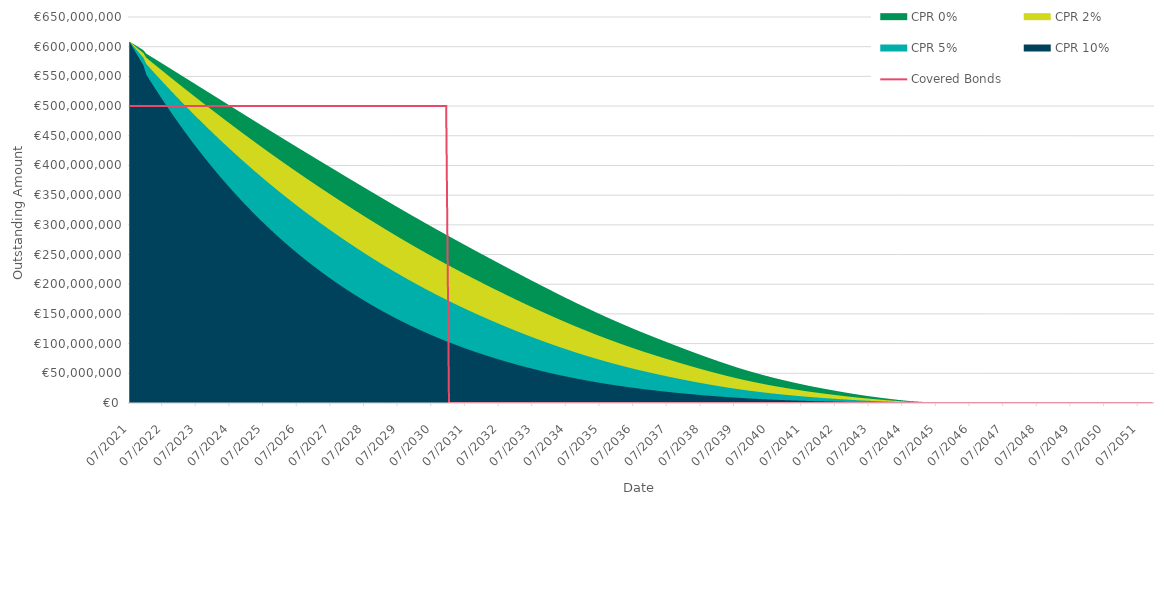
| Category | Covered Bonds |
|---|---|
| 2021-07-31 | 500000000 |
| 2021-08-31 | 500000000 |
| 2021-09-30 | 500000000 |
| 2021-10-31 | 500000000 |
| 2021-11-30 | 500000000 |
| 2021-12-31 | 500000000 |
| 2022-01-31 | 500000000 |
| 2022-02-28 | 500000000 |
| 2022-03-31 | 500000000 |
| 2022-04-30 | 500000000 |
| 2022-05-31 | 500000000 |
| 2022-06-30 | 500000000 |
| 2022-07-31 | 500000000 |
| 2022-08-31 | 500000000 |
| 2022-09-30 | 500000000 |
| 2022-10-31 | 500000000 |
| 2022-11-30 | 500000000 |
| 2022-12-31 | 500000000 |
| 2023-01-31 | 500000000 |
| 2023-02-28 | 500000000 |
| 2023-03-31 | 500000000 |
| 2023-04-30 | 500000000 |
| 2023-05-31 | 500000000 |
| 2023-06-30 | 500000000 |
| 2023-07-31 | 500000000 |
| 2023-08-31 | 500000000 |
| 2023-09-30 | 500000000 |
| 2023-10-31 | 500000000 |
| 2023-11-30 | 500000000 |
| 2023-12-31 | 500000000 |
| 2024-01-31 | 500000000 |
| 2024-02-29 | 500000000 |
| 2024-03-31 | 500000000 |
| 2024-04-30 | 500000000 |
| 2024-05-31 | 500000000 |
| 2024-06-30 | 500000000 |
| 2024-07-31 | 500000000 |
| 2024-08-31 | 500000000 |
| 2024-09-30 | 500000000 |
| 2024-10-31 | 500000000 |
| 2024-11-30 | 500000000 |
| 2024-12-31 | 500000000 |
| 2025-01-31 | 500000000 |
| 2025-02-28 | 500000000 |
| 2025-03-31 | 500000000 |
| 2025-04-30 | 500000000 |
| 2025-05-31 | 500000000 |
| 2025-06-30 | 500000000 |
| 2025-07-31 | 500000000 |
| 2025-08-31 | 500000000 |
| 2025-09-30 | 500000000 |
| 2025-10-31 | 500000000 |
| 2025-11-30 | 500000000 |
| 2025-12-31 | 500000000 |
| 2026-01-31 | 500000000 |
| 2026-02-28 | 500000000 |
| 2026-03-31 | 500000000 |
| 2026-04-30 | 500000000 |
| 2026-05-31 | 500000000 |
| 2026-06-30 | 500000000 |
| 2026-07-31 | 500000000 |
| 2026-08-31 | 500000000 |
| 2026-09-30 | 500000000 |
| 2026-10-31 | 500000000 |
| 2026-11-30 | 500000000 |
| 2026-12-31 | 500000000 |
| 2027-01-31 | 500000000 |
| 2027-02-28 | 500000000 |
| 2027-03-31 | 500000000 |
| 2027-04-30 | 500000000 |
| 2027-05-31 | 500000000 |
| 2027-06-30 | 500000000 |
| 2027-07-31 | 500000000 |
| 2027-08-31 | 500000000 |
| 2027-09-30 | 500000000 |
| 2027-10-31 | 500000000 |
| 2027-11-30 | 500000000 |
| 2027-12-31 | 500000000 |
| 2028-01-31 | 500000000 |
| 2028-02-29 | 500000000 |
| 2028-03-31 | 500000000 |
| 2028-04-30 | 500000000 |
| 2028-05-31 | 500000000 |
| 2028-06-30 | 500000000 |
| 2028-07-31 | 500000000 |
| 2028-08-31 | 500000000 |
| 2028-09-30 | 500000000 |
| 2028-10-31 | 500000000 |
| 2028-11-30 | 500000000 |
| 2028-12-31 | 500000000 |
| 2029-01-31 | 500000000 |
| 2029-02-28 | 500000000 |
| 2029-03-31 | 500000000 |
| 2029-04-30 | 500000000 |
| 2029-05-31 | 500000000 |
| 2029-06-30 | 500000000 |
| 2029-07-31 | 500000000 |
| 2029-08-31 | 500000000 |
| 2029-09-30 | 500000000 |
| 2029-10-31 | 500000000 |
| 2029-11-30 | 500000000 |
| 2029-12-31 | 500000000 |
| 2030-01-31 | 500000000 |
| 2030-02-28 | 500000000 |
| 2030-03-31 | 500000000 |
| 2030-04-30 | 500000000 |
| 2030-05-31 | 500000000 |
| 2030-06-30 | 500000000 |
| 2030-07-31 | 500000000 |
| 2030-08-31 | 500000000 |
| 2030-09-30 | 500000000 |
| 2030-10-31 | 500000000 |
| 2030-11-30 | 500000000 |
| 2030-12-31 | 500000000 |
| 2031-01-31 | 0 |
| 2031-02-28 | 0 |
| 2031-03-31 | 0 |
| 2031-04-30 | 0 |
| 2031-05-31 | 0 |
| 2031-06-30 | 0 |
| 2031-07-31 | 0 |
| 2031-08-31 | 0 |
| 2031-09-30 | 0 |
| 2031-10-31 | 0 |
| 2031-11-30 | 0 |
| 2031-12-31 | 0 |
| 2032-01-31 | 0 |
| 2032-02-29 | 0 |
| 2032-03-31 | 0 |
| 2032-04-30 | 0 |
| 2032-05-31 | 0 |
| 2032-06-30 | 0 |
| 2032-07-31 | 0 |
| 2032-08-31 | 0 |
| 2032-09-30 | 0 |
| 2032-10-31 | 0 |
| 2032-11-30 | 0 |
| 2032-12-31 | 0 |
| 2033-01-31 | 0 |
| 2033-02-28 | 0 |
| 2033-03-31 | 0 |
| 2033-04-30 | 0 |
| 2033-05-31 | 0 |
| 2033-06-30 | 0 |
| 2033-07-31 | 0 |
| 2033-08-31 | 0 |
| 2033-09-30 | 0 |
| 2033-10-31 | 0 |
| 2033-11-30 | 0 |
| 2033-12-31 | 0 |
| 2034-01-31 | 0 |
| 2034-02-28 | 0 |
| 2034-03-31 | 0 |
| 2034-04-30 | 0 |
| 2034-05-31 | 0 |
| 2034-06-30 | 0 |
| 2034-07-31 | 0 |
| 2034-08-31 | 0 |
| 2034-09-30 | 0 |
| 2034-10-31 | 0 |
| 2034-11-30 | 0 |
| 2034-12-31 | 0 |
| 2035-01-31 | 0 |
| 2035-02-28 | 0 |
| 2035-03-31 | 0 |
| 2035-04-30 | 0 |
| 2035-05-31 | 0 |
| 2035-06-30 | 0 |
| 2035-07-31 | 0 |
| 2035-08-31 | 0 |
| 2035-09-30 | 0 |
| 2035-10-31 | 0 |
| 2035-11-30 | 0 |
| 2035-12-31 | 0 |
| 2036-01-31 | 0 |
| 2036-02-29 | 0 |
| 2036-03-31 | 0 |
| 2036-04-30 | 0 |
| 2036-05-31 | 0 |
| 2036-06-30 | 0 |
| 2036-07-31 | 0 |
| 2036-08-31 | 0 |
| 2036-09-30 | 0 |
| 2036-10-31 | 0 |
| 2036-11-30 | 0 |
| 2036-12-31 | 0 |
| 2037-01-31 | 0 |
| 2037-02-28 | 0 |
| 2037-03-31 | 0 |
| 2037-04-30 | 0 |
| 2037-05-31 | 0 |
| 2037-06-30 | 0 |
| 2037-07-31 | 0 |
| 2037-08-31 | 0 |
| 2037-09-30 | 0 |
| 2037-10-31 | 0 |
| 2037-11-30 | 0 |
| 2037-12-31 | 0 |
| 2038-01-31 | 0 |
| 2038-02-28 | 0 |
| 2038-03-31 | 0 |
| 2038-04-30 | 0 |
| 2038-05-31 | 0 |
| 2038-06-30 | 0 |
| 2038-07-31 | 0 |
| 2038-08-31 | 0 |
| 2038-09-30 | 0 |
| 2038-10-31 | 0 |
| 2038-11-30 | 0 |
| 2038-12-31 | 0 |
| 2039-01-31 | 0 |
| 2039-02-28 | 0 |
| 2039-03-31 | 0 |
| 2039-04-30 | 0 |
| 2039-05-31 | 0 |
| 2039-06-30 | 0 |
| 2039-07-31 | 0 |
| 2039-08-31 | 0 |
| 2039-09-30 | 0 |
| 2039-10-31 | 0 |
| 2039-11-30 | 0 |
| 2039-12-31 | 0 |
| 2040-01-31 | 0 |
| 2040-02-29 | 0 |
| 2040-03-31 | 0 |
| 2040-04-30 | 0 |
| 2040-05-31 | 0 |
| 2040-06-30 | 0 |
| 2040-07-31 | 0 |
| 2040-08-31 | 0 |
| 2040-09-30 | 0 |
| 2040-10-31 | 0 |
| 2040-11-30 | 0 |
| 2040-12-31 | 0 |
| 2041-01-31 | 0 |
| 2041-02-28 | 0 |
| 2041-03-31 | 0 |
| 2041-04-30 | 0 |
| 2041-05-31 | 0 |
| 2041-06-30 | 0 |
| 2041-07-31 | 0 |
| 2041-08-31 | 0 |
| 2041-09-30 | 0 |
| 2041-10-31 | 0 |
| 2041-11-30 | 0 |
| 2041-12-31 | 0 |
| 2042-01-31 | 0 |
| 2042-02-28 | 0 |
| 2042-03-31 | 0 |
| 2042-04-30 | 0 |
| 2042-05-31 | 0 |
| 2042-06-30 | 0 |
| 2042-07-31 | 0 |
| 2042-08-31 | 0 |
| 2042-09-30 | 0 |
| 2042-10-31 | 0 |
| 2042-11-30 | 0 |
| 2042-12-31 | 0 |
| 2043-01-31 | 0 |
| 2043-02-28 | 0 |
| 2043-03-31 | 0 |
| 2043-04-30 | 0 |
| 2043-05-31 | 0 |
| 2043-06-30 | 0 |
| 2043-07-31 | 0 |
| 2043-08-31 | 0 |
| 2043-09-30 | 0 |
| 2043-10-31 | 0 |
| 2043-11-30 | 0 |
| 2043-12-31 | 0 |
| 2044-01-31 | 0 |
| 2044-02-29 | 0 |
| 2044-03-31 | 0 |
| 2044-04-30 | 0 |
| 2044-05-31 | 0 |
| 2044-06-30 | 0 |
| 2044-07-31 | 0 |
| 2044-08-31 | 0 |
| 2044-09-30 | 0 |
| 2044-10-31 | 0 |
| 2044-11-30 | 0 |
| 2044-12-31 | 0 |
| 2045-01-31 | 0 |
| 2045-02-28 | 0 |
| 2045-03-31 | 0 |
| 2045-04-30 | 0 |
| 2045-05-31 | 0 |
| 2045-06-30 | 0 |
| 2045-07-31 | 0 |
| 2045-08-31 | 0 |
| 2045-09-30 | 0 |
| 2045-10-31 | 0 |
| 2045-11-30 | 0 |
| 2045-12-31 | 0 |
| 2046-01-31 | 0 |
| 2046-02-28 | 0 |
| 2046-03-31 | 0 |
| 2046-04-30 | 0 |
| 2046-05-31 | 0 |
| 2046-06-30 | 0 |
| 2046-07-31 | 0 |
| 2046-08-31 | 0 |
| 2046-09-30 | 0 |
| 2046-10-31 | 0 |
| 2046-11-30 | 0 |
| 2046-12-31 | 0 |
| 2047-01-31 | 0 |
| 2047-02-28 | 0 |
| 2047-03-31 | 0 |
| 2047-04-30 | 0 |
| 2047-05-31 | 0 |
| 2047-06-30 | 0 |
| 2047-07-31 | 0 |
| 2047-08-31 | 0 |
| 2047-09-30 | 0 |
| 2047-10-31 | 0 |
| 2047-11-30 | 0 |
| 2047-12-31 | 0 |
| 2048-01-31 | 0 |
| 2048-02-29 | 0 |
| 2048-03-31 | 0 |
| 2048-04-30 | 0 |
| 2048-05-31 | 0 |
| 2048-06-30 | 0 |
| 2048-07-31 | 0 |
| 2048-08-31 | 0 |
| 2048-09-30 | 0 |
| 2048-10-31 | 0 |
| 2048-11-30 | 0 |
| 2048-12-31 | 0 |
| 2049-01-31 | 0 |
| 2049-02-28 | 0 |
| 2049-03-31 | 0 |
| 2049-04-30 | 0 |
| 2049-05-31 | 0 |
| 2049-06-30 | 0 |
| 2049-07-31 | 0 |
| 2049-08-31 | 0 |
| 2049-09-30 | 0 |
| 2049-10-31 | 0 |
| 2049-11-30 | 0 |
| 2049-12-31 | 0 |
| 2050-01-31 | 0 |
| 2050-02-28 | 0 |
| 2050-03-31 | 0 |
| 2050-04-30 | 0 |
| 2050-05-31 | 0 |
| 2050-06-30 | 0 |
| 2050-07-31 | 0 |
| 2050-08-31 | 0 |
| 2050-09-30 | 0 |
| 2050-10-31 | 0 |
| 2050-11-30 | 0 |
| 2050-12-31 | 0 |
| 2051-01-31 | 0 |
| 2051-02-28 | 0 |
| 2051-03-31 | 0 |
| 2051-04-30 | 0 |
| 2051-05-31 | 0 |
| 2051-06-30 | 0 |
| 2051-07-31 | 0 |
| 2051-08-31 | 0 |
| 2051-09-30 | 0 |
| 2051-10-31 | 0 |
| 2051-11-30 | 0 |
| 2051-12-31 | 0 |